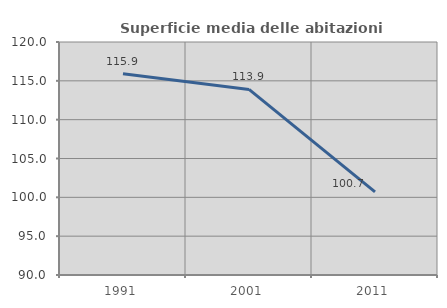
| Category | Superficie media delle abitazioni occupate |
|---|---|
| 1991.0 | 115.915 |
| 2001.0 | 113.898 |
| 2011.0 | 100.702 |